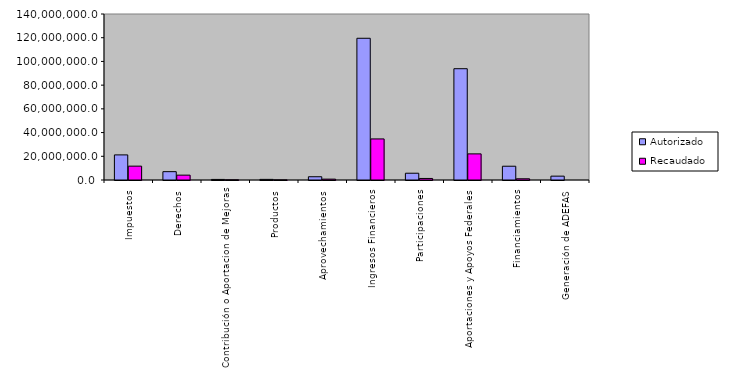
| Category | Autorizado | Recaudado |
|---|---|---|
| 0 | 21168954.6 | 11681700.7 |
| 1 | 7025502.6 | 4093998.9 |
| 2 | 481215.9 | 173764 |
| 3 | 523505.1 | 112421.7 |
| 4 | 2742104.7 | 729066.4 |
| 5 | 119522887.5 | 34641270.4 |
| 6 | 5716826.6 | 1295933.6 |
| 7 | 93864085.8 | 22031921.5 |
| 8 | 11609817.9 | 1030299.1 |
| 9 | 3243691 | 0 |